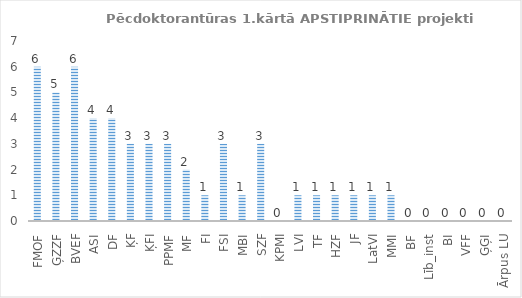
| Category | Series 0 |
|---|---|
| FMOF | 6 |
| ĢZZF | 5 |
| BVEF | 6 |
| ASI | 4 |
| DF | 4 |
| ĶF | 3 |
| ĶFI | 3 |
| PPMF | 3 |
| MF | 2 |
| FI | 1 |
| FSI | 3 |
| MBI | 1 |
| SZF | 3 |
| KPMI | 0 |
| LVI | 1 |
| TF | 1 |
| HZF | 1 |
| JF | 1 |
| LatVI | 1 |
| MMI | 1 |
| BF | 0 |
| Līb_inst | 0 |
| BI | 0 |
| VFF | 0 |
| ĢĢI | 0 |
| Ārpus LU | 0 |